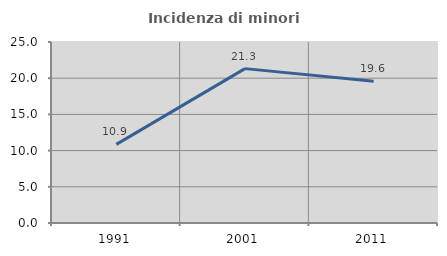
| Category | Incidenza di minori stranieri |
|---|---|
| 1991.0 | 10.864 |
| 2001.0 | 21.323 |
| 2011.0 | 19.574 |